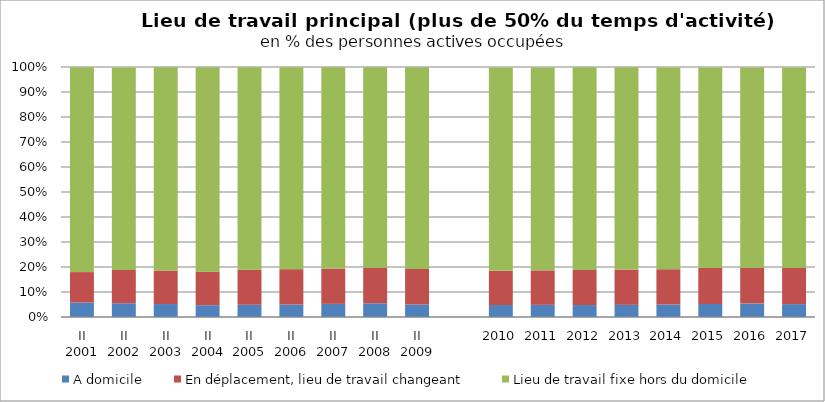
| Category | A domicile | En déplacement, lieu de travail changeant | Lieu de travail fixe hors du domicile |
|---|---|---|---|
| II
2001 | 0.058 | 0.122 | 0.819 |
| II
2002 | 0.055 | 0.133 | 0.81 |
| II
2003 | 0.052 | 0.134 | 0.813 |
| II
2004 | 0.047 | 0.134 | 0.818 |
| II
2005 | 0.049 | 0.14 | 0.81 |
| II
2006 | 0.05 | 0.142 | 0.808 |
| II
2007 | 0.053 | 0.141 | 0.805 |
| II
2008 | 0.055 | 0.142 | 0.802 |
| II
2009 | 0.05 | 0.142 | 0.806 |
|  | 0 | 0 | 0 |
| 2010 | 0.048 | 0.137 | 0.814 |
| 2011 | 0.049 | 0.138 | 0.812 |
| 2012 | 0.048 | 0.141 | 0.81 |
| 2013 | 0.049 | 0.141 | 0.809 |
| 2014 | 0.05 | 0.141 | 0.807 |
| 2015 | 0.052 | 0.144 | 0.802 |
| 2016 | 0.054 | 0.144 | 0.801 |
| 2017 | 0.052 | 0.145 | 0.802 |